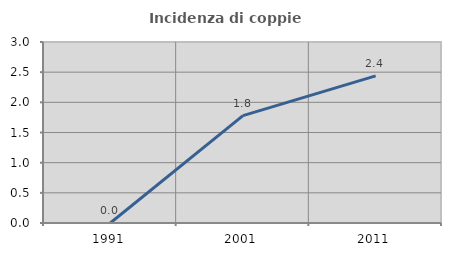
| Category | Incidenza di coppie miste |
|---|---|
| 1991.0 | 0 |
| 2001.0 | 1.78 |
| 2011.0 | 2.439 |